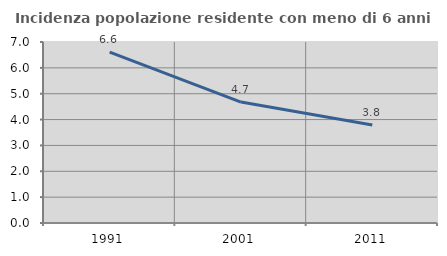
| Category | Incidenza popolazione residente con meno di 6 anni |
|---|---|
| 1991.0 | 6.611 |
| 2001.0 | 4.678 |
| 2011.0 | 3.787 |